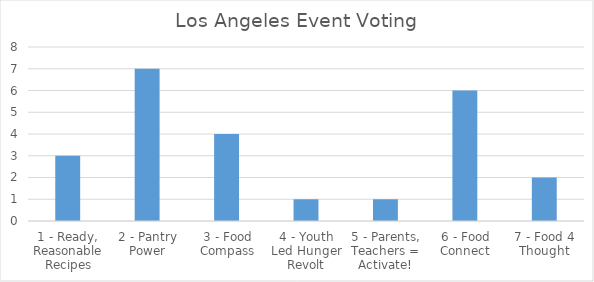
| Category | Los Angeles Event Voting |
|---|---|
| 1 - Ready, Reasonable Recipes | 3 |
| 2 - Pantry Power | 7 |
| 3 - Food Compass | 4 |
| 4 - Youth Led Hunger Revolt | 1 |
| 5 - Parents, Teachers = Activate! | 1 |
| 6 - Food Connect | 6 |
| 7 - Food 4 Thought | 2 |